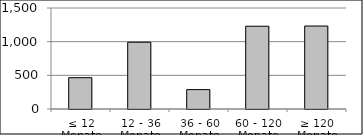
| Category | Volumen |
|---|---|
| ≤ 12 Monate | 465158268.71 |
| 12 - 36 Monate | 991696841.97 |
| 36 - 60 Monate | 287797113.27 |
| 60 - 120 Monate | 1229330197.698 |
| ≥ 120 Monate | 1232359361.933 |